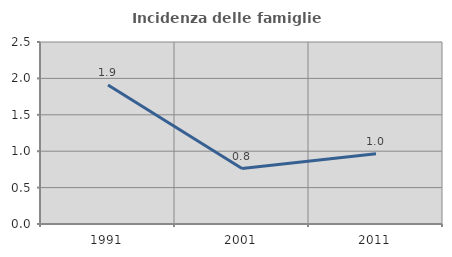
| Category | Incidenza delle famiglie numerose |
|---|---|
| 1991.0 | 1.909 |
| 2001.0 | 0.762 |
| 2011.0 | 0.966 |